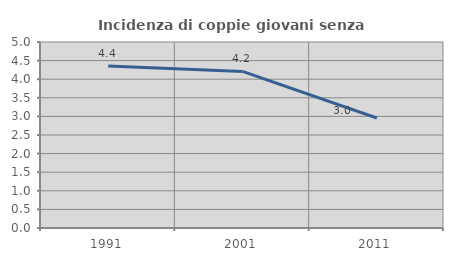
| Category | Incidenza di coppie giovani senza figli |
|---|---|
| 1991.0 | 4.352 |
| 2001.0 | 4.21 |
| 2011.0 | 2.957 |